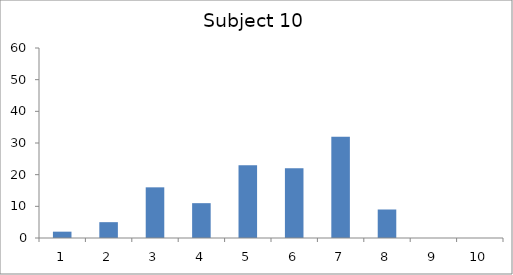
| Category | Frequency |
|---|---|
| 0 | 2 |
| 1 | 5 |
| 2 | 16 |
| 3 | 11 |
| 4 | 23 |
| 5 | 22 |
| 6 | 32 |
| 7 | 9 |
| 8 | 0 |
| 9 | 0 |